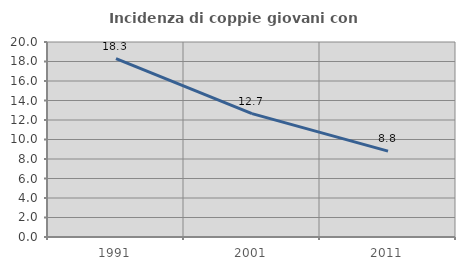
| Category | Incidenza di coppie giovani con figli |
|---|---|
| 1991.0 | 18.297 |
| 2001.0 | 12.653 |
| 2011.0 | 8.813 |